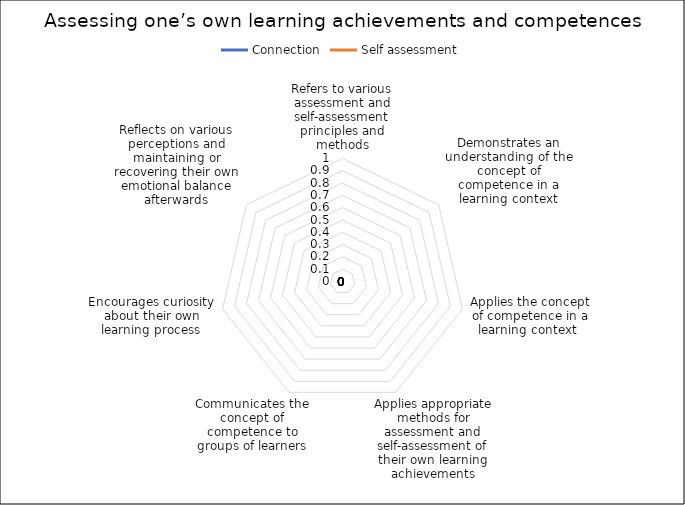
| Category | Connection | Self assessment |
|---|---|---|
| Refers to various assessment and self-assessment principles and methods | 0 | 0 |
| Demonstrates an understanding of the concept of competence in a learning context | 0 | 0 |
| Applies the concept of competence in a learning context  | 0 | 0 |
| Applies appropriate methods for assessment and self-assessment of their own learning achievements | 0 | 0 |
| Communicates the concept of competence to groups of learners | 0 | 0 |
| Encourages curiosity about their own learning process | 0 | 0 |
| Reflects on various perceptions and maintaining or recovering their own emotional balance afterwards | 0 | 0 |